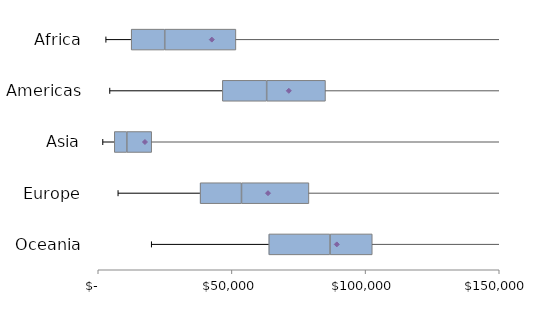
| Category | Series 0 | Series 1 | Series 2 |
|---|---|---|---|
| Africa | 12326.656 | 12537.344 | 26633.006 |
| Americas | 46415.25 | 16584.75 | 22000 |
| Asia | 6000 | 4684.75 | 9315.25 |
| Europe | 38111.983 | 15478.078 | 25218.852 |
| Oceania | 63807.047 | 22885.273 | 15808.6 |